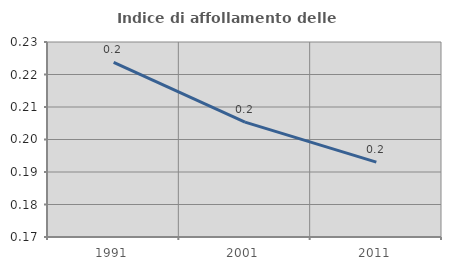
| Category | Indice di affollamento delle abitazioni  |
|---|---|
| 1991.0 | 0.224 |
| 2001.0 | 0.205 |
| 2011.0 | 0.193 |